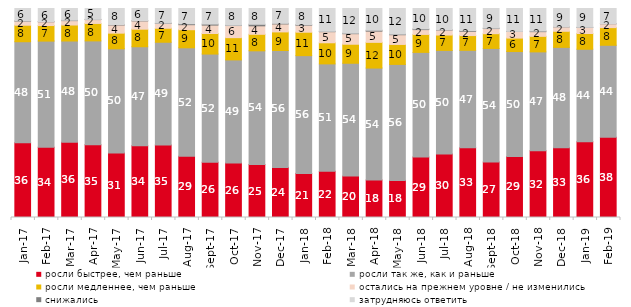
| Category | росли быстрее, чем раньше | росли так же, как и раньше | росли медленнее, чем раньше | остались на прежнем уровне / не изменились | снижались | затрудняюсь ответить |
|---|---|---|---|---|---|---|
| 2017-01-01 | 35.75 | 48.35 | 7.9 | 1.95 | 0.15 | 5.9 |
| 2017-02-01 | 33.65 | 50.75 | 7.45 | 1.8 | 0.1 | 6.25 |
| 2017-03-01 | 36 | 48.45 | 7.65 | 2.1 | 0.2 | 5.6 |
| 2017-04-01 | 34.85 | 49.65 | 8.35 | 1.85 | 0.1 | 5.2 |
| 2017-05-01 | 30.9 | 49.8 | 7.5 | 3.9 | 0.2 | 7.7 |
| 2017-06-01 | 34.3 | 47.4 | 8.4 | 3.95 | 0.15 | 5.8 |
| 2017-07-01 | 34.65 | 49.2 | 6.7 | 2.3 | 0.15 | 7 |
| 2017-08-01 | 29.3 | 51.9 | 8.65 | 2.4 | 0.45 | 7.3 |
| 2017-09-01 | 26.4 | 51.8 | 9.85 | 4 | 0.5 | 7.45 |
| 2017-10-01 | 26.1 | 49.3 | 10.65 | 5.8 | 0.15 | 8 |
| 2017-11-01 | 25.35 | 54.4 | 7.9 | 4.05 | 0.75 | 7.55 |
| 2017-12-01 | 23.95 | 55.95 | 8.9 | 3.8 | 0.3 | 7.1 |
| 2018-01-01 | 21.1 | 56.35 | 11.2 | 3.35 | 0.25 | 7.75 |
| 2018-02-01 | 22.1 | 51.4 | 10.1 | 5.3 | 0.2 | 10.9 |
| 2018-03-01 | 19.8 | 54 | 9.1 | 5.05 | 0.25 | 11.8 |
| 2018-04-01 | 17.95 | 53.55 | 12.3 | 5.35 | 0.45 | 10.4 |
| 2018-05-01 | 17.75 | 55.5 | 9.55 | 4.65 | 0.3 | 12.25 |
| 2018-06-01 | 28.9 | 50.1 | 8.6 | 2.3 | 0.35 | 9.75 |
| 2018-07-01 | 30.35 | 49.6 | 7.35 | 2.4 | 0.15 | 10.15 |
| 2018-08-01 | 33.35 | 46.65 | 7.05 | 2 | 0.35 | 10.6 |
| 2018-09-01 | 26.55 | 54.35 | 7.05 | 2.45 | 0.2 | 9.4 |
| 2018-10-01 | 29.2 | 50.2 | 6.45 | 3.15 | 0.05 | 10.95 |
| 2018-11-01 | 31.886 | 47.355 | 7.435 | 2.246 | 0.299 | 10.778 |
| 2018-12-01 | 33.4 | 48 | 7.7 | 2.1 | 0.05 | 8.75 |
| 2019-01-01 | 36.25 | 44.25 | 7.55 | 2.85 | 0.1 | 9 |
| 2019-02-01 | 38.35 | 44.05 | 8.45 | 1.85 | 0.05 | 7.25 |